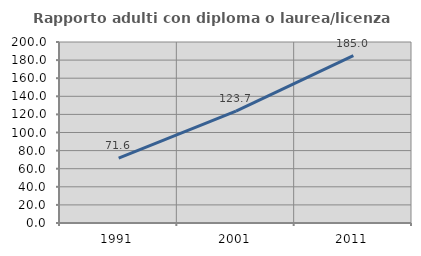
| Category | Rapporto adulti con diploma o laurea/licenza media  |
|---|---|
| 1991.0 | 71.577 |
| 2001.0 | 123.697 |
| 2011.0 | 184.982 |